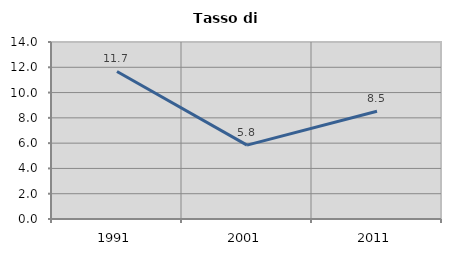
| Category | Tasso di disoccupazione   |
|---|---|
| 1991.0 | 11.67 |
| 2001.0 | 5.844 |
| 2011.0 | 8.522 |